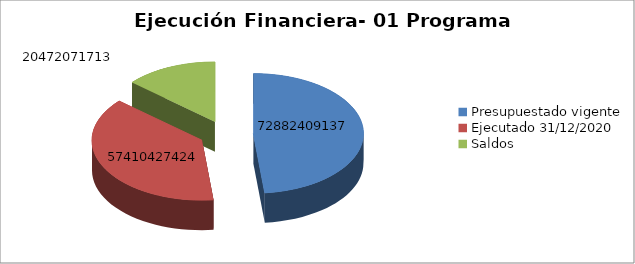
| Category | #REF! |
|---|---|
| Presupuestado vigente | 72882409137 |
| Ejecutado 31/12/2020 | 57410427424 |
| Saldos | 20472071713 |